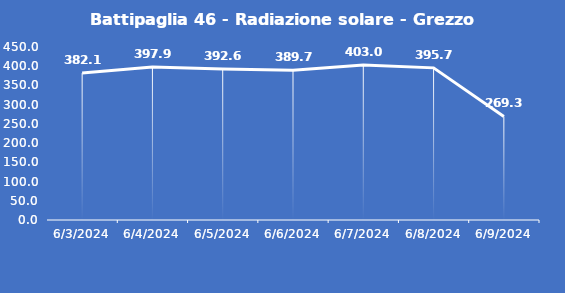
| Category | Battipaglia 46 - Radiazione solare - Grezzo (W/m2) |
|---|---|
| 6/3/24 | 382.1 |
| 6/4/24 | 397.9 |
| 6/5/24 | 392.6 |
| 6/6/24 | 389.7 |
| 6/7/24 | 403 |
| 6/8/24 | 395.7 |
| 6/9/24 | 269.3 |